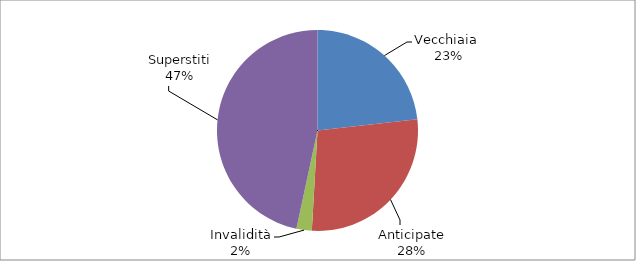
| Category | Series 0 |
|---|---|
| Vecchiaia  | 8807 |
| Anticipate | 10504 |
| Invalidità | 939 |
| Superstiti | 17689 |